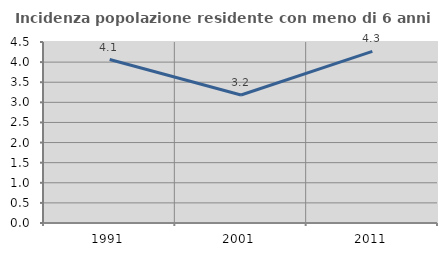
| Category | Incidenza popolazione residente con meno di 6 anni |
|---|---|
| 1991.0 | 4.064 |
| 2001.0 | 3.184 |
| 2011.0 | 4.266 |